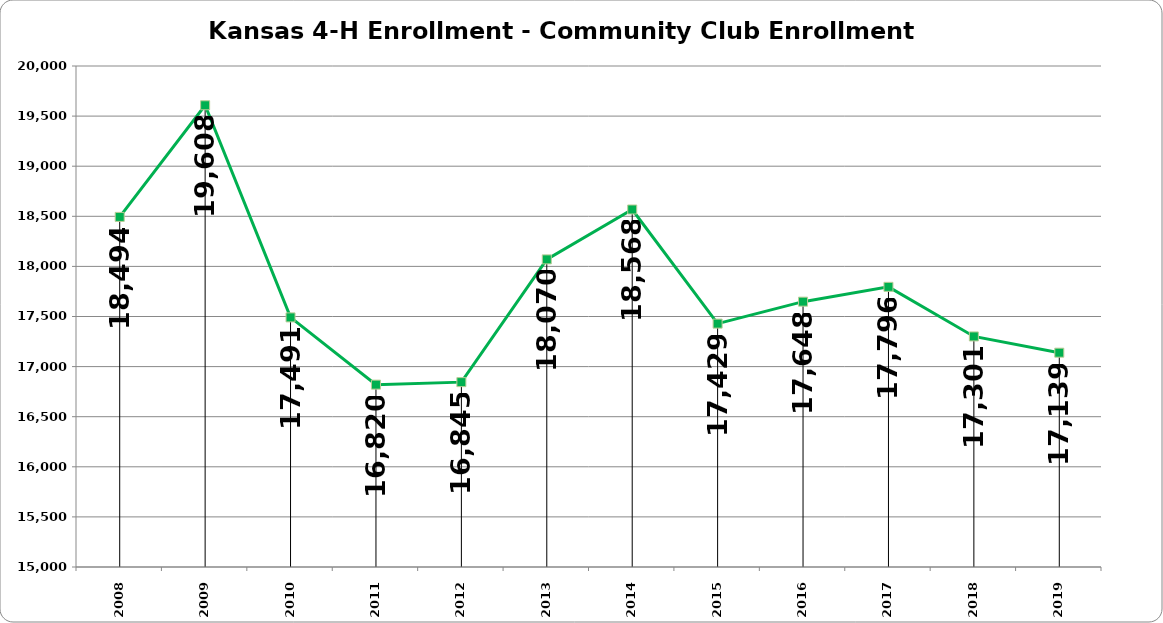
| Category | 4-H Community Clubs |
|---|---|
| 2008.0 | 18494 |
| 2009.0 | 19608 |
| 2010.0 | 17491 |
| 2011.0 | 16820 |
| 2012.0 | 16845 |
| 2013.0 | 18070 |
| 2014.0 | 18568 |
| 2015.0 | 17429 |
| 2016.0 | 17648 |
| 2017.0 | 17796 |
| 2018.0 | 17301 |
| 2019.0 | 17139 |